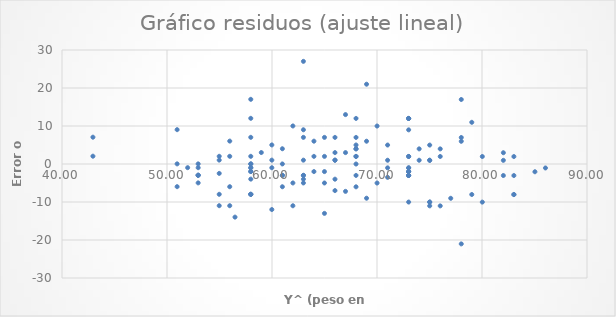
| Category | e (Residuos) |
|---|---|
| 54.97297542732292 | -2.473 |
| 75.01853466578481 | 0.981 |
| 78.0253685515541 | 5.975 |
| 62.991199122707684 | -2.991 |
| 64.99575504655388 | 7.004 |
| 51.96614154155364 | -0.966 |
| 75.01853466578481 | 0.981 |
| 52.96841950347675 | -2.968 |
| 75.01853466578481 | -10.019 |
| 73.01397874193864 | -2.014 |
| 71.00942281809245 | 4.991 |
| 55.975253389246035 | -5.975 |
| 65.99803300847697 | 3.002 |
| 52.96841950347675 | -2.968 |
| 77.02309058963101 | -9.023 |
| 54.97297542732292 | 2.027 |
| 57.979809313092204 | -1.98 |
| 57.979809313092204 | -7.98 |
| 64.99575504655388 | -4.996 |
| 65.99803300847697 | -6.998 |
| 59.9843652369384 | 1.016 |
| 67.00031097040008 | -7.2 |
| 65.99803300847697 | 7.002 |
| 63.99347708463077 | 2.007 |
| 70.00714485616936 | -5.007 |
| 62.991199122707684 | -3.991 |
| 56.47639237020758 | -13.976 |
| 42.94563988424579 | 2.054 |
| 68.00258893232316 | -3.003 |
| 73.01397874193864 | -3.014 |
| 64.99575504655388 | 2.004 |
| 78.0253685515541 | 6.975 |
| 59.9843652369384 | -11.984 |
| 57.979809313092204 | -0.98 |
| 57.979809313092204 | 0.02 |
| 55.975253389246035 | 2.025 |
| 76.02081262770793 | 1.979 |
| 57.979809313092204 | -7.98 |
| 73.01397874193864 | -2.014 |
| 63.99347708463077 | 6.007 |
| 57.979809313092204 | 2.02 |
| 79.02764651347721 | -8.028 |
| 80.02992447540029 | 1.97 |
| 68.00258893232316 | 1.997 |
| 73.01397874193864 | -2.014 |
| 73.01397874193864 | -3.014 |
| 60.986643198861486 | 4.013 |
| 83.03675836116957 | -8.037 |
| 80.02992447540029 | -10.03 |
| 61.9889211607846 | 10.011 |
| 68.00258893232316 | 4.997 |
| 57.979809313092204 | 17.02 |
| 69.00486689424625 | 20.995 |
| 71.00942281809245 | -3.509 |
| 57.979809313092204 | 12.02 |
| 67.00031097040008 | 3 |
| 68.00258893232316 | 1.997 |
| 50.963863579630555 | -5.964 |
| 68.00258893232316 | 11.997 |
| 83.03675836116957 | -3.037 |
| 71.00942281809245 | 0.991 |
| 58.98208727501532 | 3.018 |
| 73.01397874193864 | 8.986 |
| 82.03448039924649 | 2.966 |
| 83.03675836116957 | -8.037 |
| 60.986643198861486 | 0.013 |
| 73.01397874193864 | 11.986 |
| 75.01853466578481 | 4.981 |
| 73.01397874193864 | 11.986 |
| 68.00258893232316 | -6.003 |
| 76.02081262770793 | 3.979 |
| 73.01397874193864 | 11.986 |
| 68.00258893232316 | 6.997 |
| 73.01397874193864 | -1.014 |
| 68.00258893232316 | -0.003 |
| 73.01397874193864 | -1.014 |
| 73.01397874193864 | -3.014 |
| 54.97297542732292 | 1.027 |
| 79.02764651347721 | 10.972 |
| 60.986643198861486 | -5.987 |
| 74.01625670386173 | 0.984 |
| 50.963863579630555 | 9.036 |
| 71.00942281809245 | -1.009 |
| 68.00258893232316 | 3.997 |
| 54.97297542732292 | -10.973 |
| 50.963863579630555 | 0.036 |
| 69.00486689424625 | -9.005 |
| 64.99575504655388 | -1.996 |
| 73.01397874193864 | -10.014 |
| 63.99347708463077 | -1.993 |
| 57.979809313092204 | -3.98 |
| 75.01853466578481 | -10.019 |
| 57.979809313092204 | 7.02 |
| 57.979809313092204 | -0.98 |
| 78.0253685515541 | -21.025 |
| 57.979809313092204 | -7.98 |
| 65.99803300847697 | 1.002 |
| 62.991199122707684 | 9.009 |
| 82.03448039924649 | -3.034 |
| 62.991199122707684 | 1.009 |
| 78.0253685515541 | 16.975 |
| 57.979809313092204 | 0.02 |
| 82.03448039924649 | 0.966 |
| 73.01397874193864 | 1.986 |
| 85.04131428501577 | -2.041 |
| 86.04359224693886 | -1.044 |
| 57.979809313092204 | -1.98 |
| 62.991199122707684 | -2.991 |
| 59.9843652369384 | -0.984 |
| 62.991199122707684 | 27.009 |
| 60.986643198861486 | -2.987 |
| 61.9889211607846 | -10.989 |
| 62.991199122707684 | 7.009 |
| 69.00486689424625 | 5.995 |
| 65.99803300847697 | 1.002 |
| 55.975253389246035 | -10.975 |
| 54.97297542732292 | -7.973 |
| 42.94563988424579 | 7.054 |
| 68.00258893232316 | 3.997 |
| 76.02081262770793 | -11.021 |
| 59.9843652369384 | 5.016 |
| 62.991199122707684 | -4.991 |
| 74.01625670386173 | 3.984 |
| 61.9889211607846 | -4.989 |
| 64.99575504655388 | -12.996 |
| 52.96841950347675 | -4.968 |
| 65.99803300847697 | -3.998 |
| 75.01853466578481 | -11.019 |
| 60.986643198861486 | -2.987 |
| 55.975253389246035 | 6.025 |
| 52.96841950347675 | 0.032 |
| 73.01397874193864 | 1.986 |
| 70.00714485616936 | 9.993 |
| 67.00031097040008 | 13 |
| 52.96841950347675 | -2.968 |
| 52.96841950347675 | -0.968 |
| 83.03675836116957 | 1.963 |